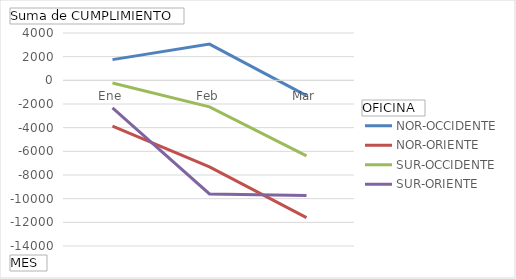
| Category | NOR-OCCIDENTE | NOR-ORIENTE | SUR-OCCIDENTE | SUR-ORIENTE |
|---|---|---|---|---|
| Ene | 1750 | -3865 | -225 | -2330 |
| Feb | 3060 | -7315 | -2245 | -9605 |
| Mar | -1290 | -11600 | -6390 | -9735 |